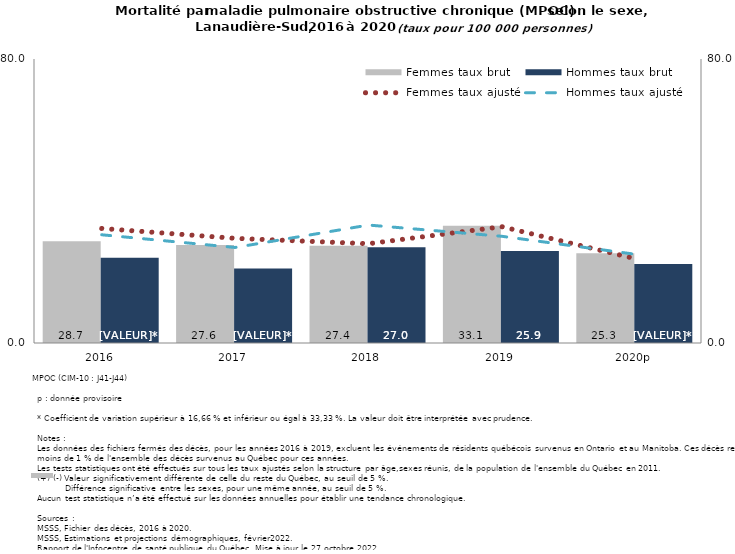
| Category | Femmes taux brut | Hommes taux brut |
|---|---|---|
| 2016 | 28.671 | 24.029 |
| 2017 | 27.636 | 20.988 |
| 2018 | 27.366 | 26.967 |
| 2019 | 33.05 | 25.945 |
| 2020p | 25.267 | 22.255 |